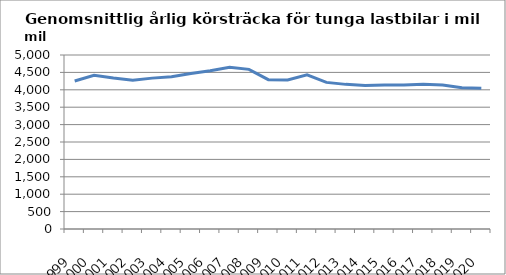
| Category | Series 0 |
|---|---|
| 1999.0 | 4254.457 |
| 2000.0 | 4417.481 |
| 2001.0 | 4338.935 |
| 2002.0 | 4273.062 |
| 2003.0 | 4335.437 |
| 2004.0 | 4376.916 |
| 2005.0 | 4466.823 |
| 2006.0 | 4548.139 |
| 2007.0 | 4648.035 |
| 2008.0 | 4586.986 |
| 2009.0 | 4291.782 |
| 2010.0 | 4282.082 |
| 2011.0 | 4430.621 |
| 2012.0 | 4212.675 |
| 2013.0 | 4156.089 |
| 2014.0 | 4125.245 |
| 2015.0 | 4136.48 |
| 2016.0 | 4138.792 |
| 2017.0 | 4162.39 |
| 2018.0 | 4137.578 |
| 2019.0 | 4057.497 |
| 2020.0 | 4041.379 |